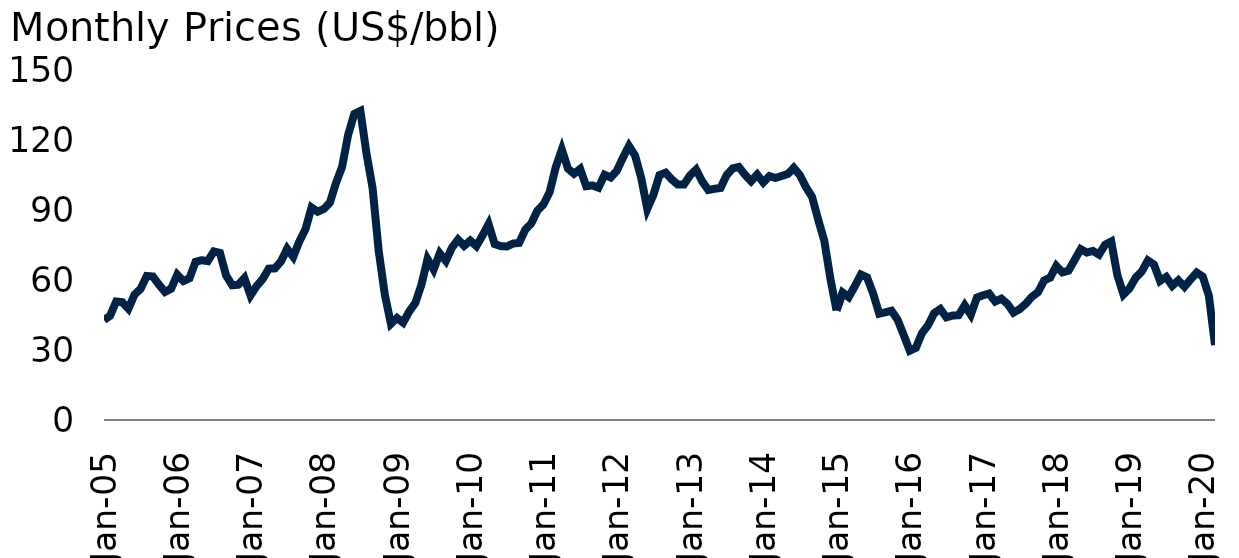
| Category | Crude |
|---|---|
| 2005-01-01 | 42.972 |
| 2005-02-01 | 44.818 |
| 2005-03-01 | 50.943 |
| 2005-04-01 | 50.64 |
| 2005-05-01 | 47.827 |
| 2005-06-01 | 53.89 |
| 2005-07-01 | 56.366 |
| 2005-08-01 | 61.891 |
| 2005-09-01 | 61.688 |
| 2005-10-01 | 58.185 |
| 2005-11-01 | 55.043 |
| 2005-12-01 | 56.43 |
| 2006-01-01 | 62.457 |
| 2006-02-01 | 59.705 |
| 2006-03-01 | 60.929 |
| 2006-04-01 | 67.971 |
| 2006-05-01 | 68.676 |
| 2006-06-01 | 68.29 |
| 2006-07-01 | 72.45 |
| 2006-08-01 | 71.812 |
| 2006-09-01 | 62.121 |
| 2006-10-01 | 57.91 |
| 2006-11-01 | 58.143 |
| 2006-12-01 | 60.994 |
| 2007-01-01 | 53.517 |
| 2007-02-01 | 57.562 |
| 2007-03-01 | 60.6 |
| 2007-04-01 | 65.058 |
| 2007-05-01 | 65.157 |
| 2007-06-01 | 68.188 |
| 2007-07-01 | 73.602 |
| 2007-08-01 | 70.127 |
| 2007-09-01 | 76.762 |
| 2007-10-01 | 81.967 |
| 2007-11-01 | 91.338 |
| 2007-12-01 | 89.52 |
| 2008-01-01 | 90.69 |
| 2008-02-01 | 93.388 |
| 2008-03-01 | 101.843 |
| 2008-04-01 | 108.758 |
| 2008-05-01 | 122.633 |
| 2008-06-01 | 131.521 |
| 2008-07-01 | 132.825 |
| 2008-08-01 | 114.567 |
| 2008-09-01 | 99.657 |
| 2008-10-01 | 72.693 |
| 2008-11-01 | 53.973 |
| 2008-12-01 | 41.339 |
| 2009-01-01 | 43.855 |
| 2009-02-01 | 41.844 |
| 2009-03-01 | 46.645 |
| 2009-04-01 | 50.278 |
| 2009-05-01 | 58.154 |
| 2009-06-01 | 69.15 |
| 2009-07-01 | 64.667 |
| 2009-08-01 | 71.63 |
| 2009-09-01 | 68.346 |
| 2009-10-01 | 74.081 |
| 2009-11-01 | 77.552 |
| 2009-12-01 | 74.882 |
| 2010-01-01 | 77.121 |
| 2010-02-01 | 74.763 |
| 2010-03-01 | 79.298 |
| 2010-04-01 | 84.183 |
| 2010-05-01 | 75.618 |
| 2010-06-01 | 74.725 |
| 2010-07-01 | 74.579 |
| 2010-08-01 | 75.826 |
| 2010-09-01 | 76.116 |
| 2010-10-01 | 81.719 |
| 2010-11-01 | 84.534 |
| 2010-12-01 | 90.006 |
| 2011-01-01 | 92.691 |
| 2011-02-01 | 97.914 |
| 2011-03-01 | 108.645 |
| 2011-04-01 | 116.243 |
| 2011-05-01 | 108.069 |
| 2011-06-01 | 105.845 |
| 2011-07-01 | 107.917 |
| 2011-08-01 | 100.486 |
| 2011-09-01 | 100.819 |
| 2011-10-01 | 99.848 |
| 2011-11-01 | 105.405 |
| 2011-12-01 | 104.23 |
| 2012-01-01 | 107.075 |
| 2012-02-01 | 112.688 |
| 2012-03-01 | 117.785 |
| 2012-04-01 | 113.666 |
| 2012-05-01 | 104.086 |
| 2012-06-01 | 90.728 |
| 2012-07-01 | 96.754 |
| 2012-08-01 | 105.274 |
| 2012-09-01 | 106.285 |
| 2012-10-01 | 103.408 |
| 2012-11-01 | 101.174 |
| 2012-12-01 | 101.194 |
| 2013-01-01 | 105.1 |
| 2013-02-01 | 107.637 |
| 2013-03-01 | 102.522 |
| 2013-04-01 | 98.852 |
| 2013-05-01 | 99.367 |
| 2013-06-01 | 99.743 |
| 2013-07-01 | 105.258 |
| 2013-08-01 | 108.158 |
| 2013-09-01 | 108.758 |
| 2013-10-01 | 105.427 |
| 2013-11-01 | 102.626 |
| 2013-12-01 | 105.482 |
| 2014-01-01 | 102.097 |
| 2014-02-01 | 104.827 |
| 2014-03-01 | 104.04 |
| 2014-04-01 | 104.867 |
| 2014-05-01 | 105.713 |
| 2014-06-01 | 108.373 |
| 2014-07-01 | 105.227 |
| 2014-08-01 | 100.05 |
| 2014-09-01 | 95.85 |
| 2014-10-01 | 86.08 |
| 2014-11-01 | 76.993 |
| 2014-12-01 | 60.703 |
| 2015-01-01 | 47.107 |
| 2015-02-01 | 54.79 |
| 2015-03-01 | 52.827 |
| 2015-04-01 | 57.543 |
| 2015-05-01 | 62.507 |
| 2015-06-01 | 61.307 |
| 2015-07-01 | 54.34 |
| 2015-08-01 | 45.69 |
| 2015-09-01 | 46.28 |
| 2015-10-01 | 46.957 |
| 2015-11-01 | 43.113 |
| 2015-12-01 | 36.573 |
| 2016-01-01 | 29.78 |
| 2016-02-01 | 31.03 |
| 2016-03-01 | 37.34 |
| 2016-04-01 | 40.75 |
| 2016-05-01 | 45.937 |
| 2016-06-01 | 47.687 |
| 2016-07-01 | 44.127 |
| 2016-08-01 | 44.877 |
| 2016-09-01 | 45.043 |
| 2016-10-01 | 49.293 |
| 2016-11-01 | 45.26 |
| 2016-12-01 | 52.62 |
| 2017-01-01 | 53.59 |
| 2017-02-01 | 54.353 |
| 2017-03-01 | 50.903 |
| 2017-04-01 | 52.163 |
| 2017-05-01 | 49.893 |
| 2017-06-01 | 46.167 |
| 2017-07-01 | 47.657 |
| 2017-08-01 | 49.943 |
| 2017-09-01 | 52.95 |
| 2017-10-01 | 54.92 |
| 2017-11-01 | 59.933 |
| 2017-12-01 | 61.187 |
| 2018-01-01 | 66.227 |
| 2018-02-01 | 63.46 |
| 2018-03-01 | 64.167 |
| 2018-04-01 | 68.793 |
| 2018-05-01 | 73.43 |
| 2018-06-01 | 71.977 |
| 2018-07-01 | 72.667 |
| 2018-08-01 | 71.083 |
| 2018-09-01 | 75.363 |
| 2018-10-01 | 76.727 |
| 2018-11-01 | 62.317 |
| 2018-12-01 | 53.96 |
| 2019-01-01 | 56.583 |
| 2019-02-01 | 61.133 |
| 2019-03-01 | 63.787 |
| 2019-04-01 | 68.577 |
| 2019-05-01 | 66.833 |
| 2019-06-01 | 59.76 |
| 2019-07-01 | 61.477 |
| 2019-08-01 | 57.67 |
| 2019-09-01 | 60.04 |
| 2019-10-01 | 57.273 |
| 2019-11-01 | 60.403 |
| 2019-12-01 | 63.353 |
| 2020-01-01 | 61.627 |
| 2020-02-01 | 53.347 |
| 2020-03-01 | 32.203 |